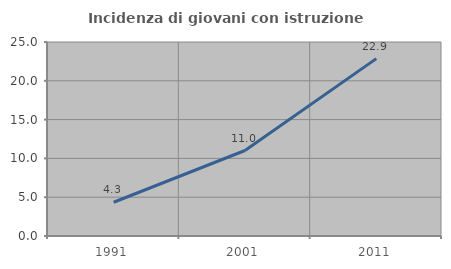
| Category | Incidenza di giovani con istruzione universitaria |
|---|---|
| 1991.0 | 4.348 |
| 2001.0 | 11.017 |
| 2011.0 | 22.857 |